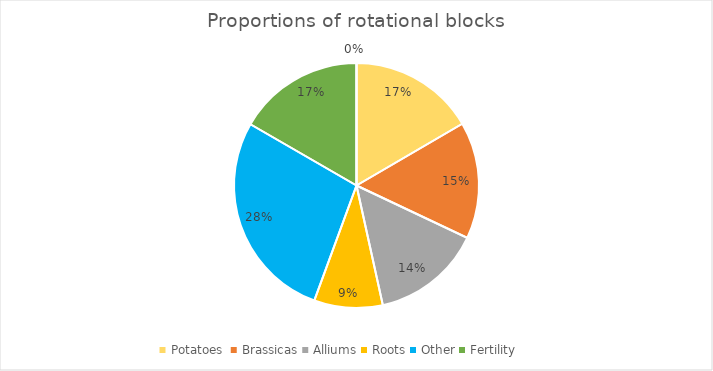
| Category | Series 0 |
|---|---|
| Potatoes  | 0.183 |
| Brassicas | 0.17 |
| Alliums | 0.16 |
| Roots | 0.1 |
| Other | 0.306 |
| Fertility | 0.184 |